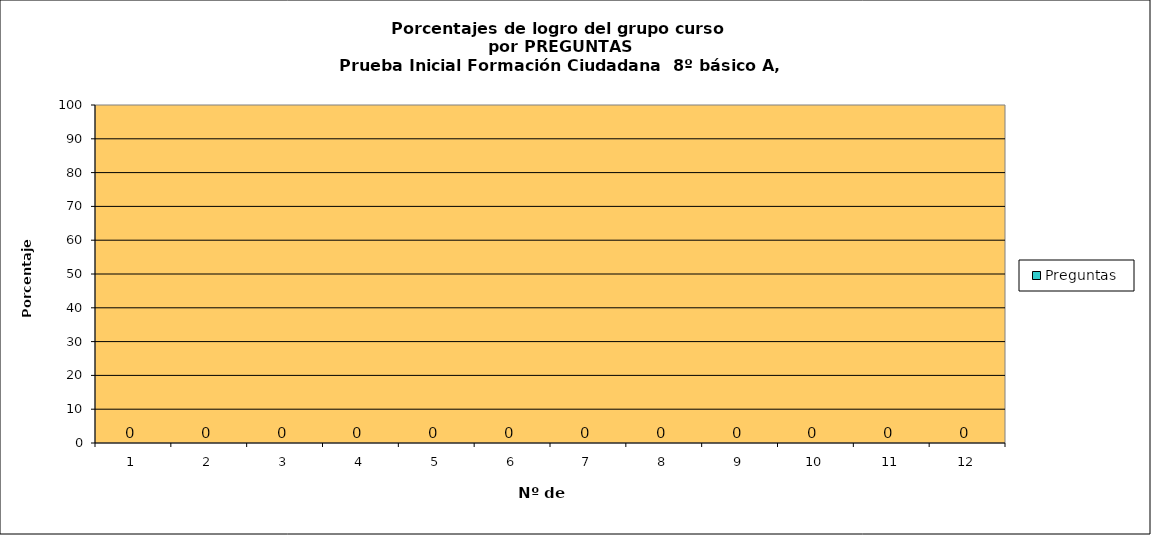
| Category | Preguntas |
|---|---|
| 0 | 0 |
| 1 | 0 |
| 2 | 0 |
| 3 | 0 |
| 4 | 0 |
| 5 | 0 |
| 6 | 0 |
| 7 | 0 |
| 8 | 0 |
| 9 | 0 |
| 10 | 0 |
| 11 | 0 |